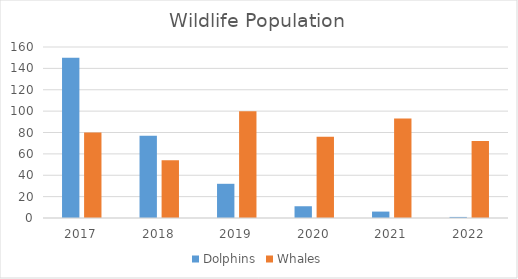
| Category | Dolphins | Whales |
|---|---|---|
| 2017.0 | 150 | 80 |
| 2018.0 | 77 | 54 |
| 2019.0 | 32 | 100 |
| 2020.0 | 11 | 76 |
| 2021.0 | 6 | 93 |
| 2022.0 | 1 | 72 |